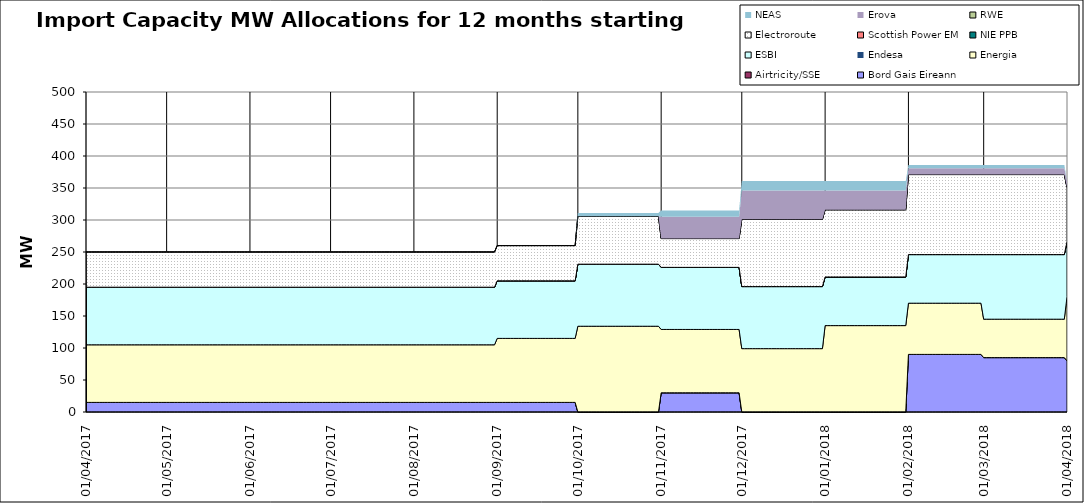
| Category | Bord Gais Eireann | Airtricity/SSE | Energia | Endesa | ESBI | NIE PPB | Scottish Power EM | Electroroute | RWE | Erova | NEAS |
|---|---|---|---|---|---|---|---|---|---|---|---|
| 01/04/2017 | 15 | 0 | 90 | 0 | 90 | 0 | 0 | 55 | 0 | 0 | 0 |
| 02/04/2017 | 15 | 0 | 90 | 0 | 90 | 0 | 0 | 55 | 0 | 0 | 0 |
| 03/04/2017 | 15 | 0 | 90 | 0 | 90 | 0 | 0 | 55 | 0 | 0 | 0 |
| 04/04/2017 | 15 | 0 | 90 | 0 | 90 | 0 | 0 | 55 | 0 | 0 | 0 |
| 05/04/2017 | 15 | 0 | 90 | 0 | 90 | 0 | 0 | 55 | 0 | 0 | 0 |
| 06/04/2017 | 15 | 0 | 90 | 0 | 90 | 0 | 0 | 55 | 0 | 0 | 0 |
| 07/04/2017 | 15 | 0 | 90 | 0 | 90 | 0 | 0 | 55 | 0 | 0 | 0 |
| 08/04/2017 | 15 | 0 | 90 | 0 | 90 | 0 | 0 | 55 | 0 | 0 | 0 |
| 09/04/2017 | 15 | 0 | 90 | 0 | 90 | 0 | 0 | 55 | 0 | 0 | 0 |
| 10/04/2017 | 15 | 0 | 90 | 0 | 90 | 0 | 0 | 55 | 0 | 0 | 0 |
| 11/04/2017 | 15 | 0 | 90 | 0 | 90 | 0 | 0 | 55 | 0 | 0 | 0 |
| 12/04/2017 | 15 | 0 | 90 | 0 | 90 | 0 | 0 | 55 | 0 | 0 | 0 |
| 13/04/2017 | 15 | 0 | 90 | 0 | 90 | 0 | 0 | 55 | 0 | 0 | 0 |
| 14/04/2017 | 15 | 0 | 90 | 0 | 90 | 0 | 0 | 55 | 0 | 0 | 0 |
| 15/04/2017 | 15 | 0 | 90 | 0 | 90 | 0 | 0 | 55 | 0 | 0 | 0 |
| 16/04/2017 | 15 | 0 | 90 | 0 | 90 | 0 | 0 | 55 | 0 | 0 | 0 |
| 17/04/2017 | 15 | 0 | 90 | 0 | 90 | 0 | 0 | 55 | 0 | 0 | 0 |
| 18/04/2017 | 15 | 0 | 90 | 0 | 90 | 0 | 0 | 55 | 0 | 0 | 0 |
| 19/04/2017 | 15 | 0 | 90 | 0 | 90 | 0 | 0 | 55 | 0 | 0 | 0 |
| 20/04/2017 | 15 | 0 | 90 | 0 | 90 | 0 | 0 | 55 | 0 | 0 | 0 |
| 21/04/2017 | 15 | 0 | 90 | 0 | 90 | 0 | 0 | 55 | 0 | 0 | 0 |
| 22/04/2017 | 15 | 0 | 90 | 0 | 90 | 0 | 0 | 55 | 0 | 0 | 0 |
| 23/04/2017 | 15 | 0 | 90 | 0 | 90 | 0 | 0 | 55 | 0 | 0 | 0 |
| 24/04/2017 | 15 | 0 | 90 | 0 | 90 | 0 | 0 | 55 | 0 | 0 | 0 |
| 25/04/2017 | 15 | 0 | 90 | 0 | 90 | 0 | 0 | 55 | 0 | 0 | 0 |
| 26/04/2017 | 15 | 0 | 90 | 0 | 90 | 0 | 0 | 55 | 0 | 0 | 0 |
| 27/04/2017 | 15 | 0 | 90 | 0 | 90 | 0 | 0 | 55 | 0 | 0 | 0 |
| 28/04/2017 | 15 | 0 | 90 | 0 | 90 | 0 | 0 | 55 | 0 | 0 | 0 |
| 29/04/2017 | 15 | 0 | 90 | 0 | 90 | 0 | 0 | 55 | 0 | 0 | 0 |
| 30/04/2017 | 15 | 0 | 90 | 0 | 90 | 0 | 0 | 55 | 0 | 0 | 0 |
| 01/05/2017 | 15 | 0 | 90 | 0 | 90 | 0 | 0 | 55 | 0 | 0 | 0 |
| 02/05/2017 | 15 | 0 | 90 | 0 | 90 | 0 | 0 | 55 | 0 | 0 | 0 |
| 03/05/2017 | 15 | 0 | 90 | 0 | 90 | 0 | 0 | 55 | 0 | 0 | 0 |
| 04/05/2017 | 15 | 0 | 90 | 0 | 90 | 0 | 0 | 55 | 0 | 0 | 0 |
| 05/05/2017 | 15 | 0 | 90 | 0 | 90 | 0 | 0 | 55 | 0 | 0 | 0 |
| 06/05/2017 | 15 | 0 | 90 | 0 | 90 | 0 | 0 | 55 | 0 | 0 | 0 |
| 07/05/2017 | 15 | 0 | 90 | 0 | 90 | 0 | 0 | 55 | 0 | 0 | 0 |
| 08/05/2017 | 15 | 0 | 90 | 0 | 90 | 0 | 0 | 55 | 0 | 0 | 0 |
| 09/05/2017 | 15 | 0 | 90 | 0 | 90 | 0 | 0 | 55 | 0 | 0 | 0 |
| 10/05/2017 | 15 | 0 | 90 | 0 | 90 | 0 | 0 | 55 | 0 | 0 | 0 |
| 11/05/2017 | 15 | 0 | 90 | 0 | 90 | 0 | 0 | 55 | 0 | 0 | 0 |
| 12/05/2017 | 15 | 0 | 90 | 0 | 90 | 0 | 0 | 55 | 0 | 0 | 0 |
| 13/05/2017 | 15 | 0 | 90 | 0 | 90 | 0 | 0 | 55 | 0 | 0 | 0 |
| 14/05/2017 | 15 | 0 | 90 | 0 | 90 | 0 | 0 | 55 | 0 | 0 | 0 |
| 15/05/2017 | 15 | 0 | 90 | 0 | 90 | 0 | 0 | 55 | 0 | 0 | 0 |
| 16/05/2017 | 15 | 0 | 90 | 0 | 90 | 0 | 0 | 55 | 0 | 0 | 0 |
| 17/05/2017 | 15 | 0 | 90 | 0 | 90 | 0 | 0 | 55 | 0 | 0 | 0 |
| 18/05/2017 | 15 | 0 | 90 | 0 | 90 | 0 | 0 | 55 | 0 | 0 | 0 |
| 19/05/2017 | 15 | 0 | 90 | 0 | 90 | 0 | 0 | 55 | 0 | 0 | 0 |
| 20/05/2017 | 15 | 0 | 90 | 0 | 90 | 0 | 0 | 55 | 0 | 0 | 0 |
| 21/05/2017 | 15 | 0 | 90 | 0 | 90 | 0 | 0 | 55 | 0 | 0 | 0 |
| 22/05/2017 | 15 | 0 | 90 | 0 | 90 | 0 | 0 | 55 | 0 | 0 | 0 |
| 23/05/2017 | 15 | 0 | 90 | 0 | 90 | 0 | 0 | 55 | 0 | 0 | 0 |
| 24/05/2017 | 15 | 0 | 90 | 0 | 90 | 0 | 0 | 55 | 0 | 0 | 0 |
| 25/05/2017 | 15 | 0 | 90 | 0 | 90 | 0 | 0 | 55 | 0 | 0 | 0 |
| 26/05/2017 | 15 | 0 | 90 | 0 | 90 | 0 | 0 | 55 | 0 | 0 | 0 |
| 27/05/2017 | 15 | 0 | 90 | 0 | 90 | 0 | 0 | 55 | 0 | 0 | 0 |
| 28/05/2017 | 15 | 0 | 90 | 0 | 90 | 0 | 0 | 55 | 0 | 0 | 0 |
| 29/05/2017 | 15 | 0 | 90 | 0 | 90 | 0 | 0 | 55 | 0 | 0 | 0 |
| 30/05/2017 | 15 | 0 | 90 | 0 | 90 | 0 | 0 | 55 | 0 | 0 | 0 |
| 31/05/2017 | 15 | 0 | 90 | 0 | 90 | 0 | 0 | 55 | 0 | 0 | 0 |
| 01/06/2017 | 15 | 0 | 90 | 0 | 90 | 0 | 0 | 55 | 0 | 0 | 0 |
| 02/06/2017 | 15 | 0 | 90 | 0 | 90 | 0 | 0 | 55 | 0 | 0 | 0 |
| 03/06/2017 | 15 | 0 | 90 | 0 | 90 | 0 | 0 | 55 | 0 | 0 | 0 |
| 04/06/2017 | 15 | 0 | 90 | 0 | 90 | 0 | 0 | 55 | 0 | 0 | 0 |
| 05/06/2017 | 15 | 0 | 90 | 0 | 90 | 0 | 0 | 55 | 0 | 0 | 0 |
| 06/06/2017 | 15 | 0 | 90 | 0 | 90 | 0 | 0 | 55 | 0 | 0 | 0 |
| 07/06/2017 | 15 | 0 | 90 | 0 | 90 | 0 | 0 | 55 | 0 | 0 | 0 |
| 08/06/2017 | 15 | 0 | 90 | 0 | 90 | 0 | 0 | 55 | 0 | 0 | 0 |
| 09/06/2017 | 15 | 0 | 90 | 0 | 90 | 0 | 0 | 55 | 0 | 0 | 0 |
| 10/06/2017 | 15 | 0 | 90 | 0 | 90 | 0 | 0 | 55 | 0 | 0 | 0 |
| 11/06/2017 | 15 | 0 | 90 | 0 | 90 | 0 | 0 | 55 | 0 | 0 | 0 |
| 12/06/2017 | 15 | 0 | 90 | 0 | 90 | 0 | 0 | 55 | 0 | 0 | 0 |
| 13/06/2017 | 15 | 0 | 90 | 0 | 90 | 0 | 0 | 55 | 0 | 0 | 0 |
| 14/06/2017 | 15 | 0 | 90 | 0 | 90 | 0 | 0 | 55 | 0 | 0 | 0 |
| 15/06/2017 | 15 | 0 | 90 | 0 | 90 | 0 | 0 | 55 | 0 | 0 | 0 |
| 16/06/2017 | 15 | 0 | 90 | 0 | 90 | 0 | 0 | 55 | 0 | 0 | 0 |
| 17/06/2017 | 15 | 0 | 90 | 0 | 90 | 0 | 0 | 55 | 0 | 0 | 0 |
| 18/06/2017 | 15 | 0 | 90 | 0 | 90 | 0 | 0 | 55 | 0 | 0 | 0 |
| 19/06/2017 | 15 | 0 | 90 | 0 | 90 | 0 | 0 | 55 | 0 | 0 | 0 |
| 20/06/2017 | 15 | 0 | 90 | 0 | 90 | 0 | 0 | 55 | 0 | 0 | 0 |
| 21/06/2017 | 15 | 0 | 90 | 0 | 90 | 0 | 0 | 55 | 0 | 0 | 0 |
| 22/06/2017 | 15 | 0 | 90 | 0 | 90 | 0 | 0 | 55 | 0 | 0 | 0 |
| 23/06/2017 | 15 | 0 | 90 | 0 | 90 | 0 | 0 | 55 | 0 | 0 | 0 |
| 24/06/2017 | 15 | 0 | 90 | 0 | 90 | 0 | 0 | 55 | 0 | 0 | 0 |
| 25/06/2017 | 15 | 0 | 90 | 0 | 90 | 0 | 0 | 55 | 0 | 0 | 0 |
| 26/06/2017 | 15 | 0 | 90 | 0 | 90 | 0 | 0 | 55 | 0 | 0 | 0 |
| 27/06/2017 | 15 | 0 | 90 | 0 | 90 | 0 | 0 | 55 | 0 | 0 | 0 |
| 28/06/2017 | 15 | 0 | 90 | 0 | 90 | 0 | 0 | 55 | 0 | 0 | 0 |
| 29/06/2017 | 15 | 0 | 90 | 0 | 90 | 0 | 0 | 55 | 0 | 0 | 0 |
| 30/06/2017 | 15 | 0 | 90 | 0 | 90 | 0 | 0 | 55 | 0 | 0 | 0 |
| 01/07/2017 | 15 | 0 | 90 | 0 | 90 | 0 | 0 | 55 | 0 | 0 | 0 |
| 02/07/2017 | 15 | 0 | 90 | 0 | 90 | 0 | 0 | 55 | 0 | 0 | 0 |
| 03/07/2017 | 15 | 0 | 90 | 0 | 90 | 0 | 0 | 55 | 0 | 0 | 0 |
| 04/07/2017 | 15 | 0 | 90 | 0 | 90 | 0 | 0 | 55 | 0 | 0 | 0 |
| 05/07/2017 | 15 | 0 | 90 | 0 | 90 | 0 | 0 | 55 | 0 | 0 | 0 |
| 06/07/2017 | 15 | 0 | 90 | 0 | 90 | 0 | 0 | 55 | 0 | 0 | 0 |
| 07/07/2017 | 15 | 0 | 90 | 0 | 90 | 0 | 0 | 55 | 0 | 0 | 0 |
| 08/07/2017 | 15 | 0 | 90 | 0 | 90 | 0 | 0 | 55 | 0 | 0 | 0 |
| 09/07/2017 | 15 | 0 | 90 | 0 | 90 | 0 | 0 | 55 | 0 | 0 | 0 |
| 10/07/2017 | 15 | 0 | 90 | 0 | 90 | 0 | 0 | 55 | 0 | 0 | 0 |
| 11/07/2017 | 15 | 0 | 90 | 0 | 90 | 0 | 0 | 55 | 0 | 0 | 0 |
| 12/07/2017 | 15 | 0 | 90 | 0 | 90 | 0 | 0 | 55 | 0 | 0 | 0 |
| 13/07/2017 | 15 | 0 | 90 | 0 | 90 | 0 | 0 | 55 | 0 | 0 | 0 |
| 14/07/2017 | 15 | 0 | 90 | 0 | 90 | 0 | 0 | 55 | 0 | 0 | 0 |
| 15/07/2017 | 15 | 0 | 90 | 0 | 90 | 0 | 0 | 55 | 0 | 0 | 0 |
| 16/07/2017 | 15 | 0 | 90 | 0 | 90 | 0 | 0 | 55 | 0 | 0 | 0 |
| 17/07/2017 | 15 | 0 | 90 | 0 | 90 | 0 | 0 | 55 | 0 | 0 | 0 |
| 18/07/2017 | 15 | 0 | 90 | 0 | 90 | 0 | 0 | 55 | 0 | 0 | 0 |
| 19/07/2017 | 15 | 0 | 90 | 0 | 90 | 0 | 0 | 55 | 0 | 0 | 0 |
| 20/07/2017 | 15 | 0 | 90 | 0 | 90 | 0 | 0 | 55 | 0 | 0 | 0 |
| 21/07/2017 | 15 | 0 | 90 | 0 | 90 | 0 | 0 | 55 | 0 | 0 | 0 |
| 22/07/2017 | 15 | 0 | 90 | 0 | 90 | 0 | 0 | 55 | 0 | 0 | 0 |
| 23/07/2017 | 15 | 0 | 90 | 0 | 90 | 0 | 0 | 55 | 0 | 0 | 0 |
| 24/07/2017 | 15 | 0 | 90 | 0 | 90 | 0 | 0 | 55 | 0 | 0 | 0 |
| 25/07/2017 | 15 | 0 | 90 | 0 | 90 | 0 | 0 | 55 | 0 | 0 | 0 |
| 26/07/2017 | 15 | 0 | 90 | 0 | 90 | 0 | 0 | 55 | 0 | 0 | 0 |
| 27/07/2017 | 15 | 0 | 90 | 0 | 90 | 0 | 0 | 55 | 0 | 0 | 0 |
| 28/07/2017 | 15 | 0 | 90 | 0 | 90 | 0 | 0 | 55 | 0 | 0 | 0 |
| 29/07/2017 | 15 | 0 | 90 | 0 | 90 | 0 | 0 | 55 | 0 | 0 | 0 |
| 30/07/2017 | 15 | 0 | 90 | 0 | 90 | 0 | 0 | 55 | 0 | 0 | 0 |
| 31/07/2017 | 15 | 0 | 90 | 0 | 90 | 0 | 0 | 55 | 0 | 0 | 0 |
| 01/08/2017 | 15 | 0 | 90 | 0 | 90 | 0 | 0 | 55 | 0 | 0 | 0 |
| 02/08/2017 | 15 | 0 | 90 | 0 | 90 | 0 | 0 | 55 | 0 | 0 | 0 |
| 03/08/2017 | 15 | 0 | 90 | 0 | 90 | 0 | 0 | 55 | 0 | 0 | 0 |
| 04/08/2017 | 15 | 0 | 90 | 0 | 90 | 0 | 0 | 55 | 0 | 0 | 0 |
| 05/08/2017 | 15 | 0 | 90 | 0 | 90 | 0 | 0 | 55 | 0 | 0 | 0 |
| 06/08/2017 | 15 | 0 | 90 | 0 | 90 | 0 | 0 | 55 | 0 | 0 | 0 |
| 07/08/2017 | 15 | 0 | 90 | 0 | 90 | 0 | 0 | 55 | 0 | 0 | 0 |
| 08/08/2017 | 15 | 0 | 90 | 0 | 90 | 0 | 0 | 55 | 0 | 0 | 0 |
| 09/08/2017 | 15 | 0 | 90 | 0 | 90 | 0 | 0 | 55 | 0 | 0 | 0 |
| 10/08/2017 | 15 | 0 | 90 | 0 | 90 | 0 | 0 | 55 | 0 | 0 | 0 |
| 11/08/2017 | 15 | 0 | 90 | 0 | 90 | 0 | 0 | 55 | 0 | 0 | 0 |
| 12/08/2017 | 15 | 0 | 90 | 0 | 90 | 0 | 0 | 55 | 0 | 0 | 0 |
| 13/08/2017 | 15 | 0 | 90 | 0 | 90 | 0 | 0 | 55 | 0 | 0 | 0 |
| 14/08/2017 | 15 | 0 | 90 | 0 | 90 | 0 | 0 | 55 | 0 | 0 | 0 |
| 15/08/2017 | 15 | 0 | 90 | 0 | 90 | 0 | 0 | 55 | 0 | 0 | 0 |
| 16/08/2017 | 15 | 0 | 90 | 0 | 90 | 0 | 0 | 55 | 0 | 0 | 0 |
| 17/08/2017 | 15 | 0 | 90 | 0 | 90 | 0 | 0 | 55 | 0 | 0 | 0 |
| 18/08/2017 | 15 | 0 | 90 | 0 | 90 | 0 | 0 | 55 | 0 | 0 | 0 |
| 19/08/2017 | 15 | 0 | 90 | 0 | 90 | 0 | 0 | 55 | 0 | 0 | 0 |
| 20/08/2017 | 15 | 0 | 90 | 0 | 90 | 0 | 0 | 55 | 0 | 0 | 0 |
| 21/08/2017 | 15 | 0 | 90 | 0 | 90 | 0 | 0 | 55 | 0 | 0 | 0 |
| 22/08/2017 | 15 | 0 | 90 | 0 | 90 | 0 | 0 | 55 | 0 | 0 | 0 |
| 23/08/2017 | 15 | 0 | 90 | 0 | 90 | 0 | 0 | 55 | 0 | 0 | 0 |
| 24/08/2017 | 15 | 0 | 90 | 0 | 90 | 0 | 0 | 55 | 0 | 0 | 0 |
| 25/08/2017 | 15 | 0 | 90 | 0 | 90 | 0 | 0 | 55 | 0 | 0 | 0 |
| 26/08/2017 | 15 | 0 | 90 | 0 | 90 | 0 | 0 | 55 | 0 | 0 | 0 |
| 27/08/2017 | 15 | 0 | 90 | 0 | 90 | 0 | 0 | 55 | 0 | 0 | 0 |
| 28/08/2017 | 15 | 0 | 90 | 0 | 90 | 0 | 0 | 55 | 0 | 0 | 0 |
| 29/08/2017 | 15 | 0 | 90 | 0 | 90 | 0 | 0 | 55 | 0 | 0 | 0 |
| 30/08/2017 | 15 | 0 | 90 | 0 | 90 | 0 | 0 | 55 | 0 | 0 | 0 |
| 31/08/2017 | 15 | 0 | 90 | 0 | 90 | 0 | 0 | 55 | 0 | 0 | 0 |
| 01/09/2017 | 15 | 0 | 100 | 0 | 90 | 0 | 0 | 55 | 0 | 0 | 0 |
| 02/09/2017 | 15 | 0 | 100 | 0 | 90 | 0 | 0 | 55 | 0 | 0 | 0 |
| 03/09/2017 | 15 | 0 | 100 | 0 | 90 | 0 | 0 | 55 | 0 | 0 | 0 |
| 04/09/2017 | 15 | 0 | 100 | 0 | 90 | 0 | 0 | 55 | 0 | 0 | 0 |
| 05/09/2017 | 15 | 0 | 100 | 0 | 90 | 0 | 0 | 55 | 0 | 0 | 0 |
| 06/09/2017 | 15 | 0 | 100 | 0 | 90 | 0 | 0 | 55 | 0 | 0 | 0 |
| 07/09/2017 | 15 | 0 | 100 | 0 | 90 | 0 | 0 | 55 | 0 | 0 | 0 |
| 08/09/2017 | 15 | 0 | 100 | 0 | 90 | 0 | 0 | 55 | 0 | 0 | 0 |
| 09/09/2017 | 15 | 0 | 100 | 0 | 90 | 0 | 0 | 55 | 0 | 0 | 0 |
| 10/09/2017 | 15 | 0 | 100 | 0 | 90 | 0 | 0 | 55 | 0 | 0 | 0 |
| 11/09/2017 | 15 | 0 | 100 | 0 | 90 | 0 | 0 | 55 | 0 | 0 | 0 |
| 12/09/2017 | 15 | 0 | 100 | 0 | 90 | 0 | 0 | 55 | 0 | 0 | 0 |
| 13/09/2017 | 15 | 0 | 100 | 0 | 90 | 0 | 0 | 55 | 0 | 0 | 0 |
| 14/09/2017 | 15 | 0 | 100 | 0 | 90 | 0 | 0 | 55 | 0 | 0 | 0 |
| 15/09/2017 | 15 | 0 | 100 | 0 | 90 | 0 | 0 | 55 | 0 | 0 | 0 |
| 16/09/2017 | 15 | 0 | 100 | 0 | 90 | 0 | 0 | 55 | 0 | 0 | 0 |
| 17/09/2017 | 15 | 0 | 100 | 0 | 90 | 0 | 0 | 55 | 0 | 0 | 0 |
| 18/09/2017 | 15 | 0 | 100 | 0 | 90 | 0 | 0 | 55 | 0 | 0 | 0 |
| 19/09/2017 | 15 | 0 | 100 | 0 | 90 | 0 | 0 | 55 | 0 | 0 | 0 |
| 20/09/2017 | 15 | 0 | 100 | 0 | 90 | 0 | 0 | 55 | 0 | 0 | 0 |
| 21/09/2017 | 15 | 0 | 100 | 0 | 90 | 0 | 0 | 55 | 0 | 0 | 0 |
| 22/09/2017 | 15 | 0 | 100 | 0 | 90 | 0 | 0 | 55 | 0 | 0 | 0 |
| 23/09/2017 | 15 | 0 | 100 | 0 | 90 | 0 | 0 | 55 | 0 | 0 | 0 |
| 24/09/2017 | 15 | 0 | 100 | 0 | 90 | 0 | 0 | 55 | 0 | 0 | 0 |
| 25/09/2017 | 15 | 0 | 100 | 0 | 90 | 0 | 0 | 55 | 0 | 0 | 0 |
| 26/09/2017 | 15 | 0 | 100 | 0 | 90 | 0 | 0 | 55 | 0 | 0 | 0 |
| 27/09/2017 | 15 | 0 | 100 | 0 | 90 | 0 | 0 | 55 | 0 | 0 | 0 |
| 28/09/2017 | 15 | 0 | 100 | 0 | 90 | 0 | 0 | 55 | 0 | 0 | 0 |
| 29/09/2017 | 15 | 0 | 100 | 0 | 90 | 0 | 0 | 55 | 0 | 0 | 0 |
| 30/09/2017 | 15 | 0 | 100 | 0 | 90 | 0 | 0 | 55 | 0 | 0 | 0 |
| 01/10/2017 | 0 | 0 | 134 | 0 | 97 | 0 | 0 | 75 | 0 | 0 | 5 |
| 02/10/2017 | 0 | 0 | 134 | 0 | 97 | 0 | 0 | 75 | 0 | 0 | 5 |
| 03/10/2017 | 0 | 0 | 134 | 0 | 97 | 0 | 0 | 75 | 0 | 0 | 5 |
| 04/10/2017 | 0 | 0 | 134 | 0 | 97 | 0 | 0 | 75 | 0 | 0 | 5 |
| 05/10/2017 | 0 | 0 | 134 | 0 | 97 | 0 | 0 | 75 | 0 | 0 | 5 |
| 06/10/2017 | 0 | 0 | 134 | 0 | 97 | 0 | 0 | 75 | 0 | 0 | 5 |
| 07/10/2017 | 0 | 0 | 134 | 0 | 97 | 0 | 0 | 75 | 0 | 0 | 5 |
| 08/10/2017 | 0 | 0 | 134 | 0 | 97 | 0 | 0 | 75 | 0 | 0 | 5 |
| 09/10/2017 | 0 | 0 | 134 | 0 | 97 | 0 | 0 | 75 | 0 | 0 | 5 |
| 10/10/2017 | 0 | 0 | 134 | 0 | 97 | 0 | 0 | 75 | 0 | 0 | 5 |
| 11/10/2017 | 0 | 0 | 134 | 0 | 97 | 0 | 0 | 75 | 0 | 0 | 5 |
| 12/10/2017 | 0 | 0 | 134 | 0 | 97 | 0 | 0 | 75 | 0 | 0 | 5 |
| 13/10/2017 | 0 | 0 | 134 | 0 | 97 | 0 | 0 | 75 | 0 | 0 | 5 |
| 14/10/2017 | 0 | 0 | 134 | 0 | 97 | 0 | 0 | 75 | 0 | 0 | 5 |
| 15/10/2017 | 0 | 0 | 134 | 0 | 97 | 0 | 0 | 75 | 0 | 0 | 5 |
| 16/10/2017 | 0 | 0 | 134 | 0 | 97 | 0 | 0 | 75 | 0 | 0 | 5 |
| 17/10/2017 | 0 | 0 | 134 | 0 | 97 | 0 | 0 | 75 | 0 | 0 | 5 |
| 18/10/2017 | 0 | 0 | 134 | 0 | 97 | 0 | 0 | 75 | 0 | 0 | 5 |
| 19/10/2017 | 0 | 0 | 134 | 0 | 97 | 0 | 0 | 75 | 0 | 0 | 5 |
| 20/10/2017 | 0 | 0 | 134 | 0 | 97 | 0 | 0 | 75 | 0 | 0 | 5 |
| 21/10/2017 | 0 | 0 | 134 | 0 | 97 | 0 | 0 | 75 | 0 | 0 | 5 |
| 22/10/2017 | 0 | 0 | 134 | 0 | 97 | 0 | 0 | 75 | 0 | 0 | 5 |
| 23/10/2017 | 0 | 0 | 134 | 0 | 97 | 0 | 0 | 75 | 0 | 0 | 5 |
| 24/10/2017 | 0 | 0 | 134 | 0 | 97 | 0 | 0 | 75 | 0 | 0 | 5 |
| 25/10/2017 | 0 | 0 | 134 | 0 | 97 | 0 | 0 | 75 | 0 | 0 | 5 |
| 26/10/2017 | 0 | 0 | 134 | 0 | 97 | 0 | 0 | 75 | 0 | 0 | 5 |
| 27/10/2017 | 0 | 0 | 134 | 0 | 97 | 0 | 0 | 75 | 0 | 0 | 5 |
| 28/10/2017 | 0 | 0 | 134 | 0 | 97 | 0 | 0 | 75 | 0 | 0 | 5 |
| 29/10/2017 | 0 | 0 | 134 | 0 | 97 | 0 | 0 | 75 | 0 | 0 | 5 |
| 30/10/2017 | 0 | 0 | 134 | 0 | 97 | 0 | 0 | 75 | 0 | 0 | 5 |
| 31/10/2017 | 0 | 0 | 134 | 0 | 97 | 0 | 0 | 75 | 0 | 0 | 5 |
| 01/11/2017 | 30 | 0 | 99 | 0 | 97 | 0 | 0 | 45 | 0 | 34 | 10 |
| 02/11/2017 | 30 | 0 | 99 | 0 | 97 | 0 | 0 | 45 | 0 | 34 | 10 |
| 03/11/2017 | 30 | 0 | 99 | 0 | 97 | 0 | 0 | 45 | 0 | 34 | 10 |
| 04/11/2017 | 30 | 0 | 99 | 0 | 97 | 0 | 0 | 45 | 0 | 34 | 10 |
| 05/11/2017 | 30 | 0 | 99 | 0 | 97 | 0 | 0 | 45 | 0 | 34 | 10 |
| 06/11/2017 | 30 | 0 | 99 | 0 | 97 | 0 | 0 | 45 | 0 | 34 | 10 |
| 07/11/2017 | 30 | 0 | 99 | 0 | 97 | 0 | 0 | 45 | 0 | 34 | 10 |
| 08/11/2017 | 30 | 0 | 99 | 0 | 97 | 0 | 0 | 45 | 0 | 34 | 10 |
| 09/11/2017 | 30 | 0 | 99 | 0 | 97 | 0 | 0 | 45 | 0 | 34 | 10 |
| 10/11/2017 | 30 | 0 | 99 | 0 | 97 | 0 | 0 | 45 | 0 | 34 | 10 |
| 11/11/2017 | 30 | 0 | 99 | 0 | 97 | 0 | 0 | 45 | 0 | 34 | 10 |
| 12/11/2017 | 30 | 0 | 99 | 0 | 97 | 0 | 0 | 45 | 0 | 34 | 10 |
| 13/11/2017 | 30 | 0 | 99 | 0 | 97 | 0 | 0 | 45 | 0 | 34 | 10 |
| 14/11/2017 | 30 | 0 | 99 | 0 | 97 | 0 | 0 | 45 | 0 | 34 | 10 |
| 15/11/2017 | 30 | 0 | 99 | 0 | 97 | 0 | 0 | 45 | 0 | 34 | 10 |
| 16/11/2017 | 30 | 0 | 99 | 0 | 97 | 0 | 0 | 45 | 0 | 34 | 10 |
| 17/11/2017 | 30 | 0 | 99 | 0 | 97 | 0 | 0 | 45 | 0 | 34 | 10 |
| 18/11/2017 | 30 | 0 | 99 | 0 | 97 | 0 | 0 | 45 | 0 | 34 | 10 |
| 19/11/2017 | 30 | 0 | 99 | 0 | 97 | 0 | 0 | 45 | 0 | 34 | 10 |
| 20/11/2017 | 30 | 0 | 99 | 0 | 97 | 0 | 0 | 45 | 0 | 34 | 10 |
| 21/11/2017 | 30 | 0 | 99 | 0 | 97 | 0 | 0 | 45 | 0 | 34 | 10 |
| 22/11/2017 | 30 | 0 | 99 | 0 | 97 | 0 | 0 | 45 | 0 | 34 | 10 |
| 23/11/2017 | 30 | 0 | 99 | 0 | 97 | 0 | 0 | 45 | 0 | 34 | 10 |
| 24/11/2017 | 30 | 0 | 99 | 0 | 97 | 0 | 0 | 45 | 0 | 34 | 10 |
| 25/11/2017 | 30 | 0 | 99 | 0 | 97 | 0 | 0 | 45 | 0 | 34 | 10 |
| 26/11/2017 | 30 | 0 | 99 | 0 | 97 | 0 | 0 | 45 | 0 | 34 | 10 |
| 27/11/2017 | 30 | 0 | 99 | 0 | 97 | 0 | 0 | 45 | 0 | 34 | 10 |
| 28/11/2017 | 30 | 0 | 99 | 0 | 97 | 0 | 0 | 45 | 0 | 34 | 10 |
| 29/11/2017 | 30 | 0 | 99 | 0 | 97 | 0 | 0 | 45 | 0 | 34 | 10 |
| 30/11/2017 | 30 | 0 | 99 | 0 | 97 | 0 | 0 | 45 | 0 | 34 | 10 |
| 01/12/2017 | 0 | 0 | 99 | 0 | 97 | 0 | 0 | 105 | 0 | 45 | 15 |
| 02/12/2017 | 0 | 0 | 99 | 0 | 97 | 0 | 0 | 105 | 0 | 45 | 15 |
| 03/12/2017 | 0 | 0 | 99 | 0 | 97 | 0 | 0 | 105 | 0 | 45 | 15 |
| 04/12/2017 | 0 | 0 | 99 | 0 | 97 | 0 | 0 | 105 | 0 | 45 | 15 |
| 05/12/2017 | 0 | 0 | 99 | 0 | 97 | 0 | 0 | 105 | 0 | 45 | 15 |
| 06/12/2017 | 0 | 0 | 99 | 0 | 97 | 0 | 0 | 105 | 0 | 45 | 15 |
| 07/12/2017 | 0 | 0 | 99 | 0 | 97 | 0 | 0 | 105 | 0 | 45 | 15 |
| 08/12/2017 | 0 | 0 | 99 | 0 | 97 | 0 | 0 | 105 | 0 | 45 | 15 |
| 09/12/2017 | 0 | 0 | 99 | 0 | 97 | 0 | 0 | 105 | 0 | 45 | 15 |
| 10/12/2017 | 0 | 0 | 99 | 0 | 97 | 0 | 0 | 105 | 0 | 45 | 15 |
| 11/12/2017 | 0 | 0 | 99 | 0 | 97 | 0 | 0 | 105 | 0 | 45 | 15 |
| 12/12/2017 | 0 | 0 | 99 | 0 | 97 | 0 | 0 | 105 | 0 | 45 | 15 |
| 13/12/2017 | 0 | 0 | 99 | 0 | 97 | 0 | 0 | 105 | 0 | 45 | 15 |
| 14/12/2017 | 0 | 0 | 99 | 0 | 97 | 0 | 0 | 105 | 0 | 45 | 15 |
| 15/12/2017 | 0 | 0 | 99 | 0 | 97 | 0 | 0 | 105 | 0 | 45 | 15 |
| 16/12/2017 | 0 | 0 | 99 | 0 | 97 | 0 | 0 | 105 | 0 | 45 | 15 |
| 17/12/2017 | 0 | 0 | 99 | 0 | 97 | 0 | 0 | 105 | 0 | 45 | 15 |
| 18/12/2017 | 0 | 0 | 99 | 0 | 97 | 0 | 0 | 105 | 0 | 45 | 15 |
| 19/12/2017 | 0 | 0 | 99 | 0 | 97 | 0 | 0 | 105 | 0 | 45 | 15 |
| 20/12/2017 | 0 | 0 | 99 | 0 | 97 | 0 | 0 | 105 | 0 | 45 | 15 |
| 21/12/2017 | 0 | 0 | 99 | 0 | 97 | 0 | 0 | 105 | 0 | 45 | 15 |
| 22/12/2017 | 0 | 0 | 99 | 0 | 97 | 0 | 0 | 105 | 0 | 45 | 15 |
| 23/12/2017 | 0 | 0 | 99 | 0 | 97 | 0 | 0 | 105 | 0 | 45 | 15 |
| 24/12/2017 | 0 | 0 | 99 | 0 | 97 | 0 | 0 | 105 | 0 | 45 | 15 |
| 25/12/2017 | 0 | 0 | 99 | 0 | 97 | 0 | 0 | 105 | 0 | 45 | 15 |
| 26/12/2017 | 0 | 0 | 99 | 0 | 97 | 0 | 0 | 105 | 0 | 45 | 15 |
| 27/12/2017 | 0 | 0 | 99 | 0 | 97 | 0 | 0 | 105 | 0 | 45 | 15 |
| 28/12/2017 | 0 | 0 | 99 | 0 | 97 | 0 | 0 | 105 | 0 | 45 | 15 |
| 29/12/2017 | 0 | 0 | 99 | 0 | 97 | 0 | 0 | 105 | 0 | 45 | 15 |
| 30/12/2017 | 0 | 0 | 99 | 0 | 97 | 0 | 0 | 105 | 0 | 45 | 15 |
| 31/12/2017 | 0 | 0 | 99 | 0 | 97 | 0 | 0 | 105 | 0 | 45 | 15 |
| 01/01/2018 | 0 | 0 | 135 | 0 | 76 | 0 | 0 | 105 | 0 | 30 | 15 |
| 02/01/2018 | 0 | 0 | 135 | 0 | 76 | 0 | 0 | 105 | 0 | 30 | 15 |
| 03/01/2018 | 0 | 0 | 135 | 0 | 76 | 0 | 0 | 105 | 0 | 30 | 15 |
| 04/01/2018 | 0 | 0 | 135 | 0 | 76 | 0 | 0 | 105 | 0 | 30 | 15 |
| 05/01/2018 | 0 | 0 | 135 | 0 | 76 | 0 | 0 | 105 | 0 | 30 | 15 |
| 06/01/2018 | 0 | 0 | 135 | 0 | 76 | 0 | 0 | 105 | 0 | 30 | 15 |
| 07/01/2018 | 0 | 0 | 135 | 0 | 76 | 0 | 0 | 105 | 0 | 30 | 15 |
| 08/01/2018 | 0 | 0 | 135 | 0 | 76 | 0 | 0 | 105 | 0 | 30 | 15 |
| 09/01/2018 | 0 | 0 | 135 | 0 | 76 | 0 | 0 | 105 | 0 | 30 | 15 |
| 10/01/2018 | 0 | 0 | 135 | 0 | 76 | 0 | 0 | 105 | 0 | 30 | 15 |
| 11/01/2018 | 0 | 0 | 135 | 0 | 76 | 0 | 0 | 105 | 0 | 30 | 15 |
| 12/01/2018 | 0 | 0 | 135 | 0 | 76 | 0 | 0 | 105 | 0 | 30 | 15 |
| 13/01/2018 | 0 | 0 | 135 | 0 | 76 | 0 | 0 | 105 | 0 | 30 | 15 |
| 14/01/2018 | 0 | 0 | 135 | 0 | 76 | 0 | 0 | 105 | 0 | 30 | 15 |
| 15/01/2018 | 0 | 0 | 135 | 0 | 76 | 0 | 0 | 105 | 0 | 30 | 15 |
| 16/01/2018 | 0 | 0 | 135 | 0 | 76 | 0 | 0 | 105 | 0 | 30 | 15 |
| 17/01/2018 | 0 | 0 | 135 | 0 | 76 | 0 | 0 | 105 | 0 | 30 | 15 |
| 18/01/2018 | 0 | 0 | 135 | 0 | 76 | 0 | 0 | 105 | 0 | 30 | 15 |
| 19/01/2018 | 0 | 0 | 135 | 0 | 76 | 0 | 0 | 105 | 0 | 30 | 15 |
| 20/01/2018 | 0 | 0 | 135 | 0 | 76 | 0 | 0 | 105 | 0 | 30 | 15 |
| 21/01/2018 | 0 | 0 | 135 | 0 | 76 | 0 | 0 | 105 | 0 | 30 | 15 |
| 22/01/2018 | 0 | 0 | 135 | 0 | 76 | 0 | 0 | 105 | 0 | 30 | 15 |
| 23/01/2018 | 0 | 0 | 135 | 0 | 76 | 0 | 0 | 105 | 0 | 30 | 15 |
| 24/01/2018 | 0 | 0 | 135 | 0 | 76 | 0 | 0 | 105 | 0 | 30 | 15 |
| 25/01/2018 | 0 | 0 | 135 | 0 | 76 | 0 | 0 | 105 | 0 | 30 | 15 |
| 26/01/2018 | 0 | 0 | 135 | 0 | 76 | 0 | 0 | 105 | 0 | 30 | 15 |
| 27/01/2018 | 0 | 0 | 135 | 0 | 76 | 0 | 0 | 105 | 0 | 30 | 15 |
| 28/01/2018 | 0 | 0 | 135 | 0 | 76 | 0 | 0 | 105 | 0 | 30 | 15 |
| 29/01/2018 | 0 | 0 | 135 | 0 | 76 | 0 | 0 | 105 | 0 | 30 | 15 |
| 30/01/2018 | 0 | 0 | 135 | 0 | 76 | 0 | 0 | 105 | 0 | 30 | 15 |
| 31/01/2018 | 0 | 0 | 135 | 0 | 76 | 0 | 0 | 105 | 0 | 30 | 15 |
| 01/02/2018 | 90 | 0 | 80 | 0 | 76 | 0 | 0 | 125 | 0 | 10 | 5 |
| 02/02/2018 | 90 | 0 | 80 | 0 | 76 | 0 | 0 | 125 | 0 | 10 | 5 |
| 03/02/2018 | 90 | 0 | 80 | 0 | 76 | 0 | 0 | 125 | 0 | 10 | 5 |
| 04/02/2018 | 90 | 0 | 80 | 0 | 76 | 0 | 0 | 125 | 0 | 10 | 5 |
| 05/02/2018 | 90 | 0 | 80 | 0 | 76 | 0 | 0 | 125 | 0 | 10 | 5 |
| 06/02/2018 | 90 | 0 | 80 | 0 | 76 | 0 | 0 | 125 | 0 | 10 | 5 |
| 07/02/2018 | 90 | 0 | 80 | 0 | 76 | 0 | 0 | 125 | 0 | 10 | 5 |
| 08/02/2018 | 90 | 0 | 80 | 0 | 76 | 0 | 0 | 125 | 0 | 10 | 5 |
| 09/02/2018 | 90 | 0 | 80 | 0 | 76 | 0 | 0 | 125 | 0 | 10 | 5 |
| 10/02/2018 | 90 | 0 | 80 | 0 | 76 | 0 | 0 | 125 | 0 | 10 | 5 |
| 11/02/2018 | 90 | 0 | 80 | 0 | 76 | 0 | 0 | 125 | 0 | 10 | 5 |
| 12/02/2018 | 90 | 0 | 80 | 0 | 76 | 0 | 0 | 125 | 0 | 10 | 5 |
| 13/02/2018 | 90 | 0 | 80 | 0 | 76 | 0 | 0 | 125 | 0 | 10 | 5 |
| 14/02/2018 | 90 | 0 | 80 | 0 | 76 | 0 | 0 | 125 | 0 | 10 | 5 |
| 15/02/2018 | 90 | 0 | 80 | 0 | 76 | 0 | 0 | 125 | 0 | 10 | 5 |
| 16/02/2018 | 90 | 0 | 80 | 0 | 76 | 0 | 0 | 125 | 0 | 10 | 5 |
| 17/02/2018 | 90 | 0 | 80 | 0 | 76 | 0 | 0 | 125 | 0 | 10 | 5 |
| 18/02/2018 | 90 | 0 | 80 | 0 | 76 | 0 | 0 | 125 | 0 | 10 | 5 |
| 19/02/2018 | 90 | 0 | 80 | 0 | 76 | 0 | 0 | 125 | 0 | 10 | 5 |
| 20/02/2018 | 90 | 0 | 80 | 0 | 76 | 0 | 0 | 125 | 0 | 10 | 5 |
| 21/02/2018 | 90 | 0 | 80 | 0 | 76 | 0 | 0 | 125 | 0 | 10 | 5 |
| 22/02/2018 | 90 | 0 | 80 | 0 | 76 | 0 | 0 | 125 | 0 | 10 | 5 |
| 23/02/2018 | 90 | 0 | 80 | 0 | 76 | 0 | 0 | 125 | 0 | 10 | 5 |
| 24/02/2018 | 90 | 0 | 80 | 0 | 76 | 0 | 0 | 125 | 0 | 10 | 5 |
| 25/02/2018 | 90 | 0 | 80 | 0 | 76 | 0 | 0 | 125 | 0 | 10 | 5 |
| 26/02/2018 | 90 | 0 | 80 | 0 | 76 | 0 | 0 | 125 | 0 | 10 | 5 |
| 27/02/2018 | 90 | 0 | 80 | 0 | 76 | 0 | 0 | 125 | 0 | 10 | 5 |
| 28/02/2018 | 90 | 0 | 80 | 0 | 76 | 0 | 0 | 125 | 0 | 10 | 5 |
| 01/03/2018 | 85 | 0 | 60 | 0 | 101 | 0 | 0 | 125 | 0 | 10 | 5 |
| 02/03/2018 | 85 | 0 | 60 | 0 | 101 | 0 | 0 | 125 | 0 | 10 | 5 |
| 03/03/2018 | 85 | 0 | 60 | 0 | 101 | 0 | 0 | 125 | 0 | 10 | 5 |
| 04/03/2018 | 85 | 0 | 60 | 0 | 101 | 0 | 0 | 125 | 0 | 10 | 5 |
| 05/03/2018 | 85 | 0 | 60 | 0 | 101 | 0 | 0 | 125 | 0 | 10 | 5 |
| 06/03/2018 | 85 | 0 | 60 | 0 | 101 | 0 | 0 | 125 | 0 | 10 | 5 |
| 07/03/2018 | 85 | 0 | 60 | 0 | 101 | 0 | 0 | 125 | 0 | 10 | 5 |
| 08/03/2018 | 85 | 0 | 60 | 0 | 101 | 0 | 0 | 125 | 0 | 10 | 5 |
| 09/03/2018 | 85 | 0 | 60 | 0 | 101 | 0 | 0 | 125 | 0 | 10 | 5 |
| 10/03/2018 | 85 | 0 | 60 | 0 | 101 | 0 | 0 | 125 | 0 | 10 | 5 |
| 11/03/2018 | 85 | 0 | 60 | 0 | 101 | 0 | 0 | 125 | 0 | 10 | 5 |
| 12/03/2018 | 85 | 0 | 60 | 0 | 101 | 0 | 0 | 125 | 0 | 10 | 5 |
| 13/03/2018 | 85 | 0 | 60 | 0 | 101 | 0 | 0 | 125 | 0 | 10 | 5 |
| 14/03/2018 | 85 | 0 | 60 | 0 | 101 | 0 | 0 | 125 | 0 | 10 | 5 |
| 15/03/2018 | 85 | 0 | 60 | 0 | 101 | 0 | 0 | 125 | 0 | 10 | 5 |
| 16/03/2018 | 85 | 0 | 60 | 0 | 101 | 0 | 0 | 125 | 0 | 10 | 5 |
| 17/03/2018 | 85 | 0 | 60 | 0 | 101 | 0 | 0 | 125 | 0 | 10 | 5 |
| 18/03/2018 | 85 | 0 | 60 | 0 | 101 | 0 | 0 | 125 | 0 | 10 | 5 |
| 19/03/2018 | 85 | 0 | 60 | 0 | 101 | 0 | 0 | 125 | 0 | 10 | 5 |
| 20/03/2018 | 85 | 0 | 60 | 0 | 101 | 0 | 0 | 125 | 0 | 10 | 5 |
| 21/03/2018 | 85 | 0 | 60 | 0 | 101 | 0 | 0 | 125 | 0 | 10 | 5 |
| 22/03/2018 | 85 | 0 | 60 | 0 | 101 | 0 | 0 | 125 | 0 | 10 | 5 |
| 23/03/2018 | 85 | 0 | 60 | 0 | 101 | 0 | 0 | 125 | 0 | 10 | 5 |
| 24/03/2018 | 85 | 0 | 60 | 0 | 101 | 0 | 0 | 125 | 0 | 10 | 5 |
| 25/03/2018 | 85 | 0 | 60 | 0 | 101 | 0 | 0 | 125 | 0 | 10 | 5 |
| 26/03/2018 | 85 | 0 | 60 | 0 | 101 | 0 | 0 | 125 | 0 | 10 | 5 |
| 27/03/2018 | 85 | 0 | 60 | 0 | 101 | 0 | 0 | 125 | 0 | 10 | 5 |
| 28/03/2018 | 85 | 0 | 60 | 0 | 101 | 0 | 0 | 125 | 0 | 10 | 5 |
| 29/03/2018 | 85 | 0 | 60 | 0 | 101 | 0 | 0 | 125 | 0 | 10 | 5 |
| 30/03/2018 | 85 | 0 | 60 | 0 | 101 | 0 | 0 | 125 | 0 | 10 | 5 |
| 31/03/2018 | 85 | 0 | 60 | 0 | 101 | 0 | 0 | 125 | 0 | 10 | 5 |
| 01/04/2018 | 80 | 0 | 100 | 0 | 86 | 0 | 0 | 85 | 0 | 10 | 0 |